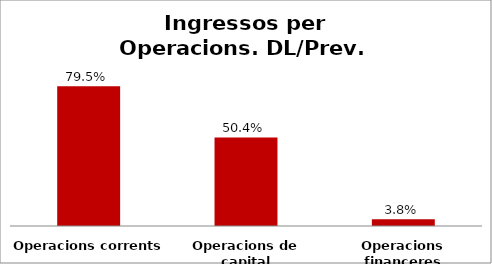
| Category | Series 0 |
|---|---|
| Operacions corrents | 0.795 |
| Operacions de capital | 0.504 |
| Operacions financeres | 0.038 |